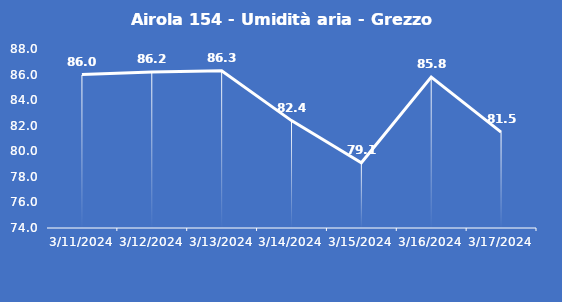
| Category | Airola 154 - Umidità aria - Grezzo (%) |
|---|---|
| 3/11/24 | 86 |
| 3/12/24 | 86.2 |
| 3/13/24 | 86.3 |
| 3/14/24 | 82.4 |
| 3/15/24 | 79.1 |
| 3/16/24 | 85.8 |
| 3/17/24 | 81.5 |